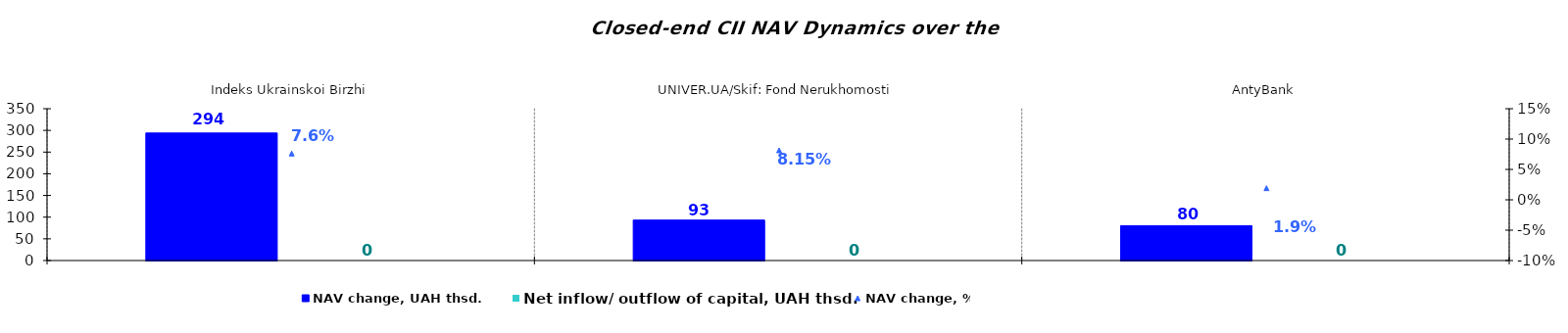
| Category | NAV change, UAH thsd. | Net inflow/ outflow of capital, UAH thsd. |
|---|---|---|
| Indeks Ukrainskoi Birzhi | 293.979 | 0 |
| UNIVER.UA/Skif: Fond Nerukhomosti | 93.243 | 0 |
| AntyBank | 80.362 | 0 |